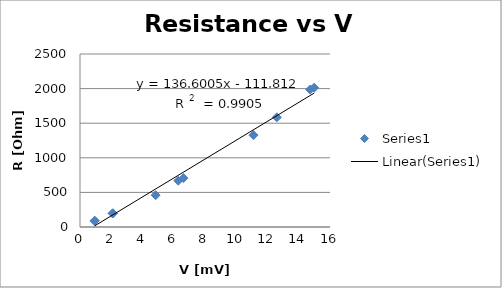
| Category | Series 0 |
|---|---|
| 0.93 | 89 |
| 0.948 | 90 |
| 2.08 | 197 |
| 2.11 | 198 |
| 4.84 | 460 |
| 6.29 | 669 |
| 6.62 | 706 |
| 11.1 | 1327 |
| 12.6 | 1585 |
| 14.727 | 1986 |
| 14.987 | 2013 |